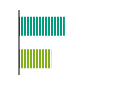
| Category | Series 0 |
|---|---|
| 0 | 72700 |
| 1 | 104382 |